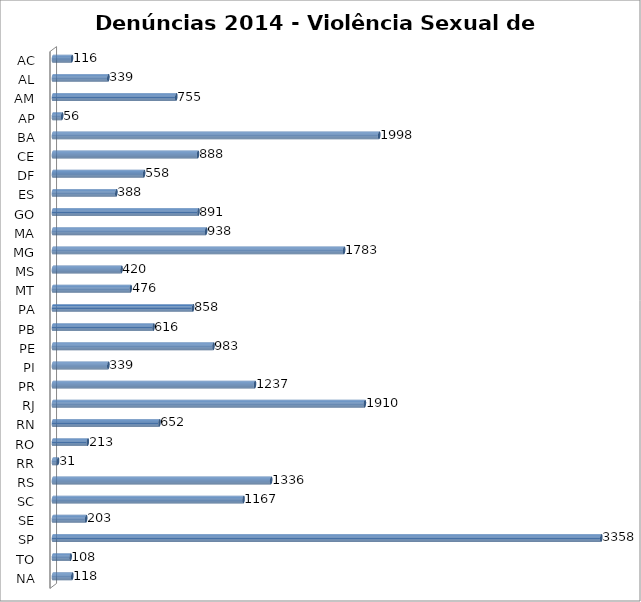
| Category | Series 0 |
|---|---|
| AC | 116 |
| AL | 339 |
| AM | 755 |
| AP | 56 |
| BA | 1998 |
| CE | 888 |
| DF | 558 |
| ES | 388 |
| GO | 891 |
| MA | 938 |
| MG | 1783 |
| MS | 420 |
| MT | 476 |
| PA | 858 |
| PB | 616 |
| PE | 983 |
| PI | 339 |
| PR | 1237 |
| RJ | 1910 |
| RN | 652 |
| RO | 213 |
| RR | 31 |
| RS | 1336 |
| SC | 1167 |
| SE | 203 |
| SP | 3358 |
| TO | 108 |
| NA | 118 |